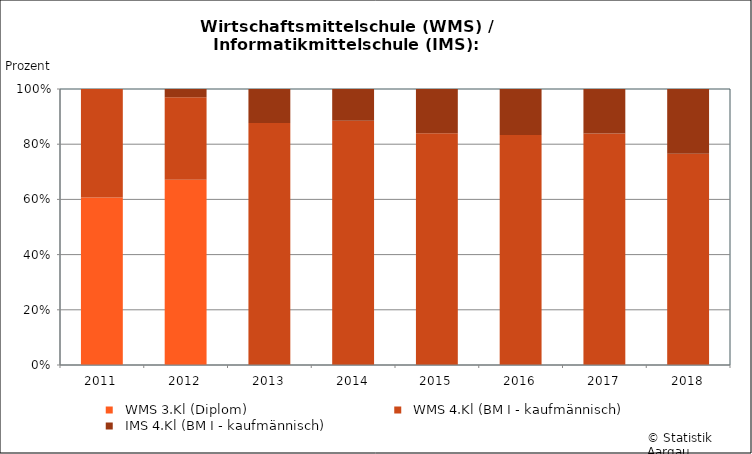
| Category |   WMS 3.Kl (Diplom) |   WMS 4.Kl (BM I - kaufmännisch) |   IMS 4.Kl (BM I - kaufmännisch) |
|---|---|---|---|
| 2011 | 119 | 77 | 0 |
| 2012 | 159 | 71 | 7 |
| 2013 | 0 | 121 | 17 |
| 2014 | 0 | 123 | 16 |
| 2015 | 0 | 84 | 16 |
| 2016 | 0 | 140 | 28 |
| 2017 | 0 | 125 | 24 |
| 2018 | 0 | 127 | 39 |